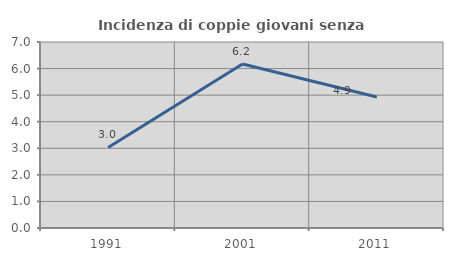
| Category | Incidenza di coppie giovani senza figli |
|---|---|
| 1991.0 | 3.03 |
| 2001.0 | 6.173 |
| 2011.0 | 4.93 |